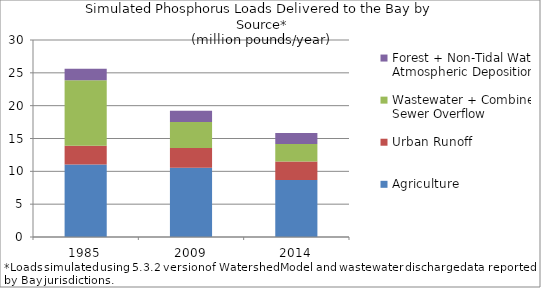
| Category | Agriculture | Urban Runoff | Wastewater + Combined Sewer Overflow | Forest + Non-Tidal Water Atmospheric Deposition |
|---|---|---|---|---|
| 1985.0 | 11.028 | 2.881 | 9.978 | 1.733 |
| 2009.0 | 10.546 | 3.01 | 3.972 | 1.701 |
| 2014.0 | 8.696 | 2.803 | 2.657 | 1.668 |